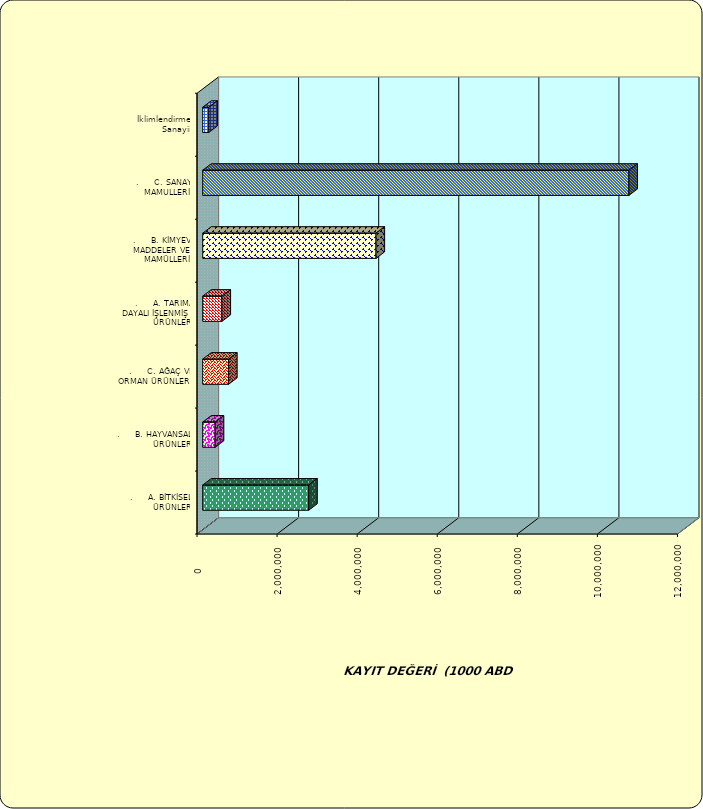
| Category | Series 0 |
|---|---|
| .     A. BİTKİSEL ÜRÜNLER | 2647224.065 |
| .     B. HAYVANSAL ÜRÜNLER | 312402.177 |
| .     C. AĞAÇ VE ORMAN ÜRÜNLERİ | 645926.217 |
| .     A. TARIMA DAYALI İŞLENMİŞ ÜRÜNLER | 481369.311 |
| .     B. KİMYEVİ MADDELER VE MAMÜLLERİ | 4329075.798 |
| .     C. SANAYİ MAMULLERİ | 10645148.872 |
|  İklimlendirme Sanayii | 152404.058 |